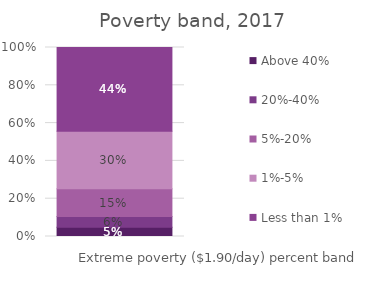
| Category | Above 40% | 20%-40% | 5%-20% | 1%-5% | Less than 1% |
|---|---|---|---|---|---|
| 0 | 0.049 | 0.057 | 0.147 | 0.305 | 0.443 |